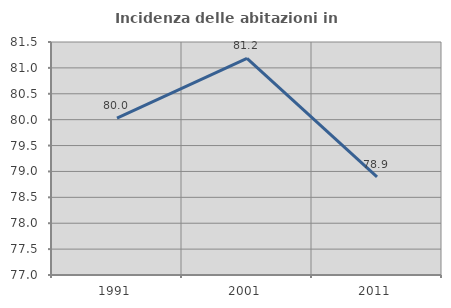
| Category | Incidenza delle abitazioni in proprietà  |
|---|---|
| 1991.0 | 80.03 |
| 2001.0 | 81.182 |
| 2011.0 | 78.897 |